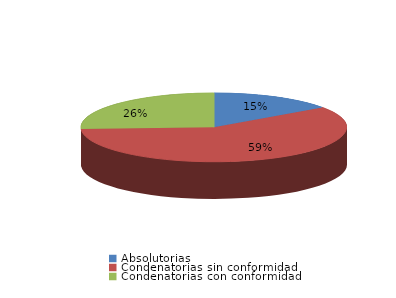
| Category | Series 0 |
|---|---|
| Absolutorias | 20 |
| Condenatorias sin conformidad | 78 |
| Condenatorias con conformidad | 34 |